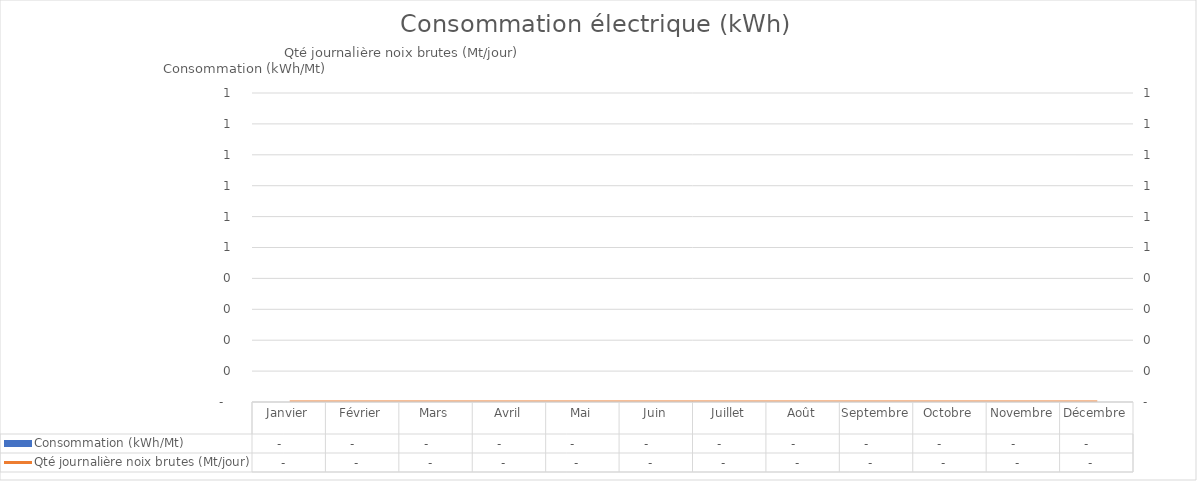
| Category |  Consommation (kWh/Mt)  |
|---|---|
| Janvier | 0 |
| Février | 0 |
| Mars | 0 |
| Avril | 0 |
| Mai | 0 |
| Juin | 0 |
| Juillet | 0 |
| Août | 0 |
| Septembre | 0 |
| Octobre | 0 |
| Novembre | 0 |
| Décembre | 0 |